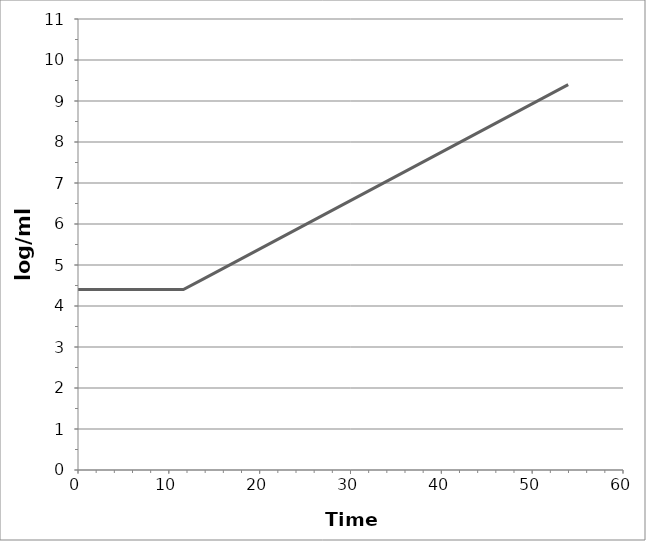
| Category | Series 0 |
|---|---|
| 0.0 | 4.4 |
| 2.8999904789898996 | 4.4 |
| 5.799980957979799 | 4.4 |
| 8.6999714369697 | 4.4 |
| 11.599961915959598 | 4.4 |
| 13.718237207557351 | 4.65 |
| 15.836512499155104 | 4.9 |
| 17.954787790752857 | 5.15 |
| 20.073063082350608 | 5.4 |
| 22.191338373948362 | 5.65 |
| 24.309613665546117 | 5.9 |
| 26.42788895714387 | 6.15 |
| 28.546164248741626 | 6.4 |
| 30.66443954033938 | 6.65 |
| 32.782714831937135 | 6.9 |
| 34.90099012353489 | 7.15 |
| 37.019265415132644 | 7.4 |
| 39.1375407067304 | 7.65 |
| 41.25581599832815 | 7.9 |
| 43.37409128992591 | 8.15 |
| 45.49236658152366 | 8.4 |
| 47.610641873121416 | 8.65 |
| 49.72891716471917 | 8.9 |
| 51.847192456316925 | 9.15 |
| 53.96546774791465 | 9.4 |